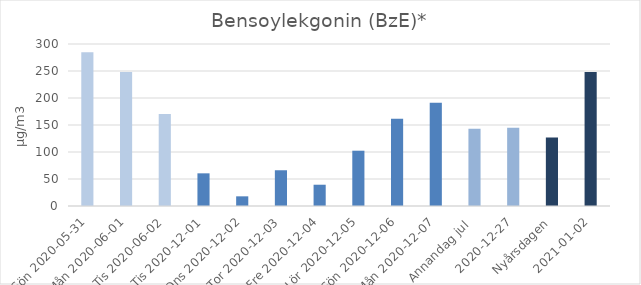
| Category | Bensoylekgonin (BzE)* |
|---|---|
| Sön 2020-05-31 | 284.9 |
| Mån 2020-06-01 | 248.2 |
|  Tis 2020-06-02 | 170.3 |
| Tis 2020-12-01 | 60.5 |
| Ons 2020-12-02 | 17.9 |
| Tor 2020-12-03 | 66.2 |
| Fre 2020-12-04 | 39.4 |
| Lör 2020-12-05 | 102.4 |
| Sön 2020-12-06 | 161.6 |
| Mån 2020-12-07 | 191 |
| Annandag jul  | 143 |
| 2020-12-27 | 145 |
| Nyårsdagen | 127 |
| 2021-01-02 | 248 |